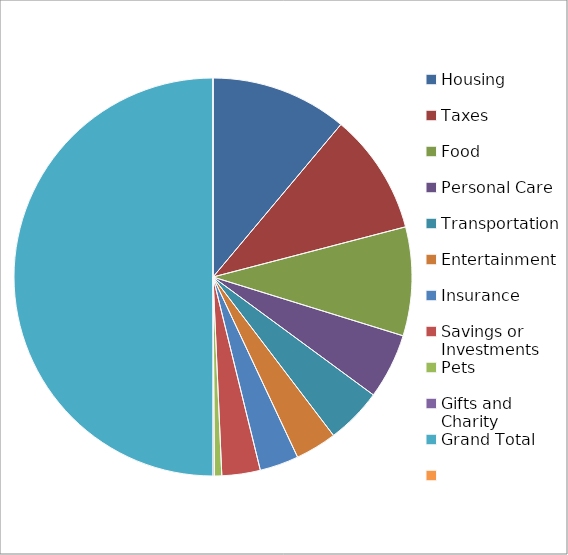
| Category | Series 2 |
|---|---|
| Housing | 0.222 |
| Taxes | 0.197 |
| Food | 0.177 |
| Personal Care | 0.106 |
| Transportation | 0.091 |
| Entertainment | 0.067 |
| Insurance | 0.063 |
| Savings or Investments | 0.062 |
| Pets | 0.012 |
| Gifts and Charity | 0.002 |
| Grand Total | 1 |